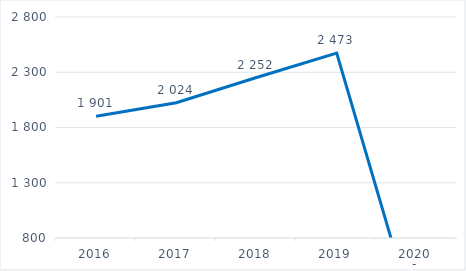
| Category | Jumlah Industri |
|---|---|
| 2016.0 | 1901 |
| 2017.0 | 2024 |
| 2018.0 | 2252 |
| 2019.0 | 2473 |
| 2020.0 | 0 |